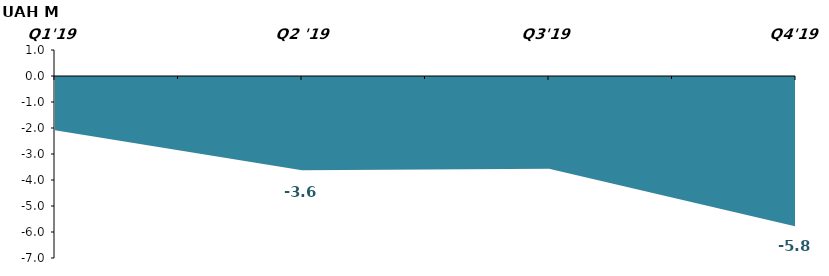
| Category | Cumulatively YTD |
|---|---|
| Q1'19 | -2.084 |
| Q2 '19 | -3.621 |
| Q3'19 | -3.57 |
| Q4'19 | -5.787 |